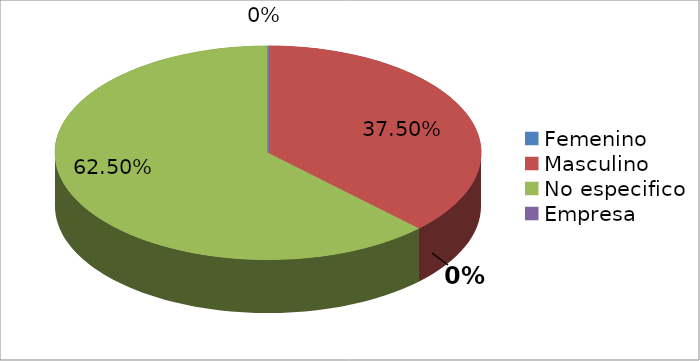
| Category | Series 0 |
|---|---|
| Femenino | 0 |
| Masculino | 6 |
| No especifico | 10 |
| Empresa | 0 |